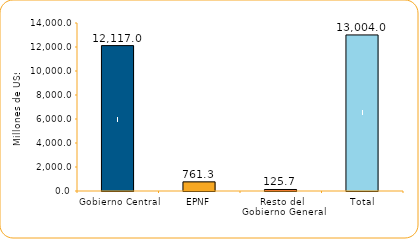
| Category | Series 1 |
|---|---|
| Gobierno Central | 12117 |
| EPNF | 761.3 |
| Resto del Gobierno General | 125.7 |
| Total | 13004 |